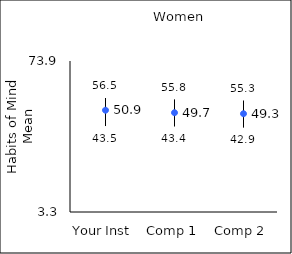
| Category | 25th percentile | 75th percentile | Mean |
|---|---|---|---|
| Your Inst | 43.5 | 56.5 | 50.88 |
| Comp 1 | 43.4 | 55.8 | 49.73 |
| Comp 2 | 42.9 | 55.3 | 49.25 |